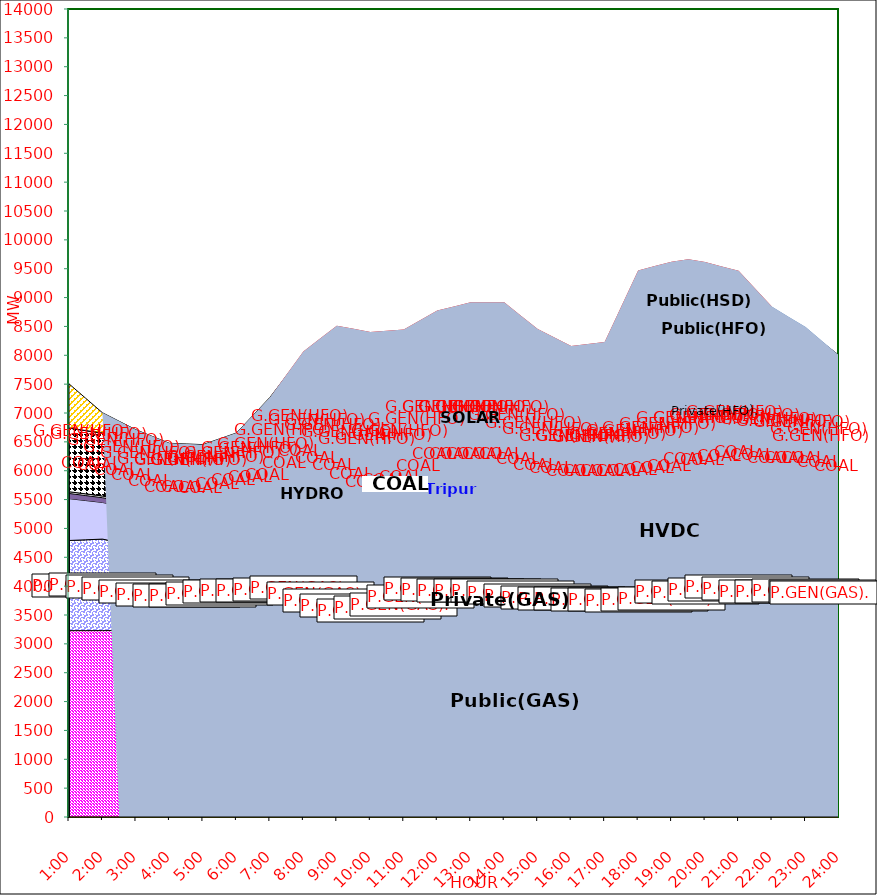
| Category | GAS | P.GEN(GAS). |  HVDC | TRIPURA | HYDRO | COAL | SOLAR | G.GEN(HFO) | P.GEN(HFO). | G.GEN(HSD) | P.GEN(HSD) | SHORTAGE | Total Energy Gen 193.080 MKWHr 
Energy Not Served   0.000 MKWHr 
Energy Requirement     193.080 MKWHr  |
|---|---|---|---|---|---|---|---|---|---|---|---|---|---|
| 1:00 | 3229 | 1562 | 725 | 90 | 30 | 1103 | 0 | 0 | 766 | 0 | 0 | 0 |  |
| 1:30 | 3229.5 | 1573.5 | 680 | 86 | 30 | 1097 | 0 | 0 | 558.5 | 0 | 0 | 0 |  |
| 2:00 | 3230 | 1585 | 635 | 82 | 30 | 1091 | 0 | 0 | 351 | 0 | 0 | 0 |  |
| 2:30 | 3231 | 1524 | 634.5 | 82 | 30 | 1038 | 0 | 0 | 317 | 0 | 0 | 0 |  |
| 3:00 | 3232 | 1463 | 634 | 82 | 30 | 985 | 0 | 0 | 283 | 0 | 0 | 0 |  |
| 3:30 | 3218.5 | 1389 | 633 | 79 | 30 | 968.5 | 0 | 0 | 274 | 0 | 0 | 0 |  |
| 4:00 | 3205 | 1315 | 632 | 76 | 30 | 952 | 0 | 0 | 265 | 0 | 0 | 0 |  |
| 4:30 | 3187 | 1318 | 632.5 | 79 | 30 | 952 | 0 | 0 | 265 | 0 | 0 | 0 |  |
| 5:00 | 3169 | 1321 | 633 | 82 | 30 | 952 | 0 | 0 | 265 | 0 | 0 | 0 |  |
| 5:30 | 3192.5 | 1357.5 | 632.5 | 85 | 30 | 957 | 0 | 0 | 298 | 0 | 0 | 0 |  |
| 6:00 | 3216 | 1394 | 632 | 88 | 30 | 962 | 0 | 0 | 331 | 0 | 0 | 0 |  |
| 6:30 | 3194 | 1448.5 | 632 | 91 | 30 | 993 | 2 | 20 | 550.5 | 0 | 0 | 0 |  |
| 7:00 | 3172 | 1503 | 632 | 94 | 30 | 1024 | 4 | 40 | 770 | 0 | 0 | 0 |  |
| 7:30 | 3166 | 1566 | 760 | 93 | 30 | 1058 | 23 | 40 | 912 | 0 | 0 | 19.814 |  |
| 8:00 | 3160 | 1629 | 888 | 92 | 30 | 1092 | 42 | 40 | 1054 | 0 | 0 | 39.628 |  |
| 8:30 | 3080.5 | 1571 | 901.5 | 98 | 30 | 1097 | 81 | 40 | 1146 | 0 | 0 | 244.217 |  |
| 9:00 | 3001 | 1513 | 915 | 104 | 30 | 1102 | 120 | 40 | 1238 | 0 | 0 | 448.807 |  |
| 9:30 | 2963 | 1402 | 915 | 106 | 30 | 1088 | 156.5 | 49.5 | 1259 | 0 | 0 | 489.356 |  |
| 10:00 | 2925 | 1291 | 915 | 108 | 30 | 1074 | 193 | 59 | 1280 | 0 | 0 | 529.906 |  |
| 10:30 | 2965 | 1314.5 | 914.5 | 104 | 30 | 1043.5 | 224 | 64 | 1300 | 0 | 0 | 465.856 |  |
| 11:00 | 3005 | 1338 | 914 | 100 | 30 | 1013 | 255 | 69 | 1320 | 0 | 0 | 401.807 |  |
| 11:30 | 3082.5 | 1476 | 915 | 105 | 30 | 976.5 | 283.5 | 72 | 1327 | 5 | 0 | 338.679 |  |
| 12:00 | 3160 | 1614 | 916 | 110 | 30 | 940 | 312 | 75 | 1334 | 10 | 0 | 275.551 |  |
| 12:30 | 3135 | 1630 | 916 | 113 | 30 | 946.5 | 310 | 75 | 1320 | 5 | 43 | 323.934 |  |
| 13:00 | 3110 | 1646 | 916 | 116 | 30 | 953 | 308 | 75 | 1306 | 0 | 86 | 372.316 |  |
| 13:30 | 3110 | 1646 | 916 | 116 | 30 | 953 | 308 | 75 | 1306 | 0 | 86 | 372.316 |  |
| 14:00 | 3110 | 1646 | 916 | 116 | 30 | 953 | 308 | 75 | 1306 | 0 | 86 | 372.316 |  |
| 14:30 | 3092 | 1586 | 915.5 | 104 | 30 | 952.5 | 242.5 | 99.5 | 1325.5 | 0 | 48 | 291.218 |  |
| 15:00 | 3074 | 1526 | 915 | 92 | 30 | 952 | 177 | 124 | 1345 | 0 | 10 | 210.119 |  |
| 15:30 | 3063.5 | 1494.5 | 915 | 94 | 30 | 920.5 | 133 | 145.5 | 1351.5 | 0 | 5 | 155.746 |  |
| 16:00 | 3053 | 1463 | 915 | 96 | 30 | 889 | 89 | 167 | 1358 | 0 | 0 | 101.373 |  |
| 16:30 | 3040.5 | 1480 | 915 | 101 | 30 | 870 | 52.5 | 226.5 | 1372.5 | 0 | 0 | 107.363 |  |
| 17:00 | 3028 | 1497 | 915 | 106 | 30 | 851 | 16 | 286 | 1387 | 0 | 0 | 113.354 |  |
| 17:30 | 3006 | 1512.5 | 915.5 | 110 | 30 | 871.5 | 8 | 379.5 | 1599 | 0 | 42.5 | 375.677 |  |
| 18:00 | 2984 | 1528 | 916 | 114 | 30 | 892 | 0 | 473 | 1811 | 0 | 85 | 638 |  |
| 18:30 | 3003 | 1532 | 916 | 114 | 30 | 923 | 0 | 475 | 1812.5 | 0 | 87.5 | 653.071 |  |
| 19:00 | 3022 | 1536 | 916 | 114 | 30 | 954 | 0 | 477 | 1814 | 0 | 90 | 668.142 |  |
| 19:30 | 3147 | 1531 | 915 | 114 | 30 | 954 | 0 | 478 | 1823 | 0 | 90 | 581.975 |  |
| 20:00 | 3109 | 1558 | 915 | 112 | 30 | 953 | 0 | 477 | 1877 | 0 | 91 | 495.807 |  |
| 20:30 | 3152 | 1580.5 | 915.5 | 111 | 30 | 954 | 0 | 462.5 | 1778.5 | 0 | 91 | 465.404 |  |
| 21:00 | 3195 | 1603 | 916 | 110 | 30 | 955 | 0 | 448 | 1680 | 0 | 91 | 435 |  |
| 21:30 | 3156.5 | 1589 | 915.5 | 109 | 30 | 954 | 0 | 424 | 1671 | 0 | 85.5 | 217.5 |  |
| 22:00 | 3118 | 1575 | 915 | 108 | 30 | 953 | 0 | 400 | 1662 | 0 | 80 | 0 |  |
| 22:30 | 3125.5 | 1574.5 | 915 | 105 | 30 | 953 | 0 | 340.5 | 1561.5 | 0 | 60 | 0 |  |
| 23:00 | 3133 | 1574 | 915 | 102 | 30 | 953 | 0 | 281 | 1461 | 0 | 40 | 0 |  |
| 23:30 | 3118.5 | 1573.5 | 868 | 96 | 30 | 953 | 0 | 176.5 | 1409 | 0 | 20 | 0 |  |
| 24:00 | 3104 | 1573 | 821 | 90 | 30 | 953 | 0 | 72 | 1357 | 0 | 0 | 0 |  |